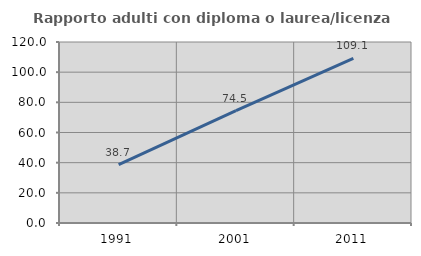
| Category | Rapporto adulti con diploma o laurea/licenza media  |
|---|---|
| 1991.0 | 38.71 |
| 2001.0 | 74.462 |
| 2011.0 | 109.091 |